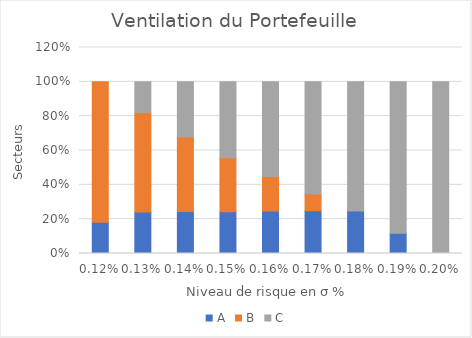
| Category | A | B | C |
|---|---|---|---|
| 0.0012 | 0.182 | 0.818 | 0 |
| 0.0013 | 0.242 | 0.579 | 0.18 |
| 0.0014 | 0.244 | 0.435 | 0.321 |
| 0.0015 | 0.244 | 0.314 | 0.442 |
| 0.0016 | 0.247 | 0.201 | 0.552 |
| 0.0017 | 0.249 | 0.097 | 0.654 |
| 0.0018 | 0.248 | 0 | 0.752 |
| 0.0019 | 0.118 | 0 | 0.882 |
| 0.002 | 0 | 0 | 1 |